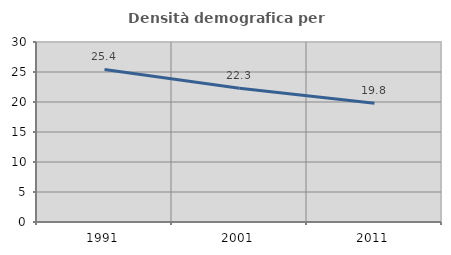
| Category | Densità demografica |
|---|---|
| 1991.0 | 25.429 |
| 2001.0 | 22.274 |
| 2011.0 | 19.782 |